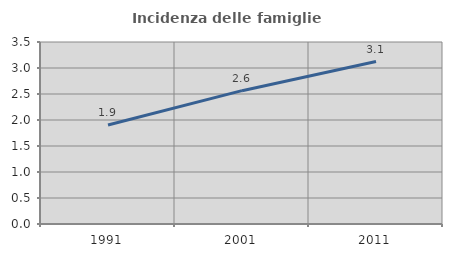
| Category | Incidenza delle famiglie numerose |
|---|---|
| 1991.0 | 1.905 |
| 2001.0 | 2.564 |
| 2011.0 | 3.125 |